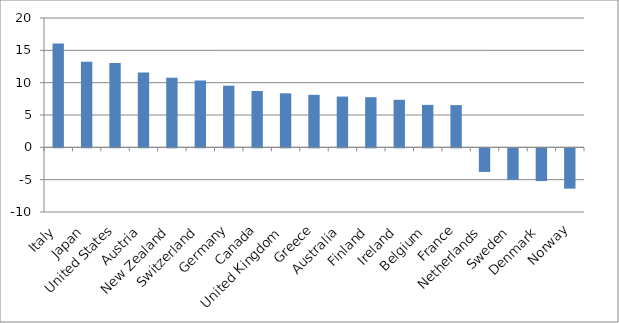
| Category | Series 0 |
|---|---|
| Italy | 16.045 |
| Japan | 13.254 |
| United States | 13.041 |
| Austria | 11.56 |
| New Zealand | 10.764 |
| Switzerland | 10.318 |
| Germany | 9.533 |
| Canada | 8.709 |
| United Kingdom | 8.356 |
| Greece | 8.118 |
| Australia | 7.851 |
| Finland | 7.753 |
| Ireland | 7.351 |
| Belgium | 6.567 |
| France | 6.53 |
| Netherlands | -3.653 |
| Sweden | -4.867 |
| Denmark | -5.059 |
| Norway | -6.234 |